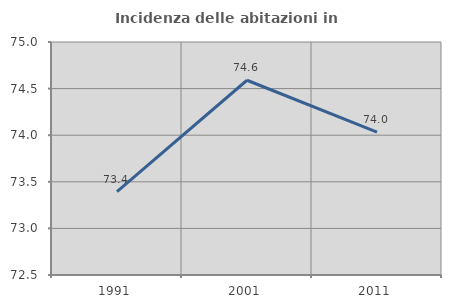
| Category | Incidenza delle abitazioni in proprietà  |
|---|---|
| 1991.0 | 73.395 |
| 2001.0 | 74.589 |
| 2011.0 | 74.033 |